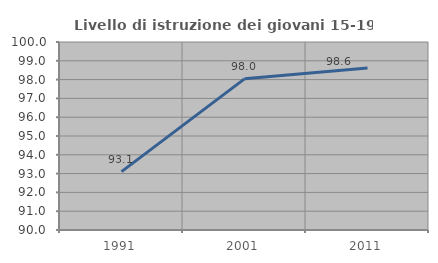
| Category | Livello di istruzione dei giovani 15-19 anni |
|---|---|
| 1991.0 | 93.103 |
| 2001.0 | 98.039 |
| 2011.0 | 98.611 |